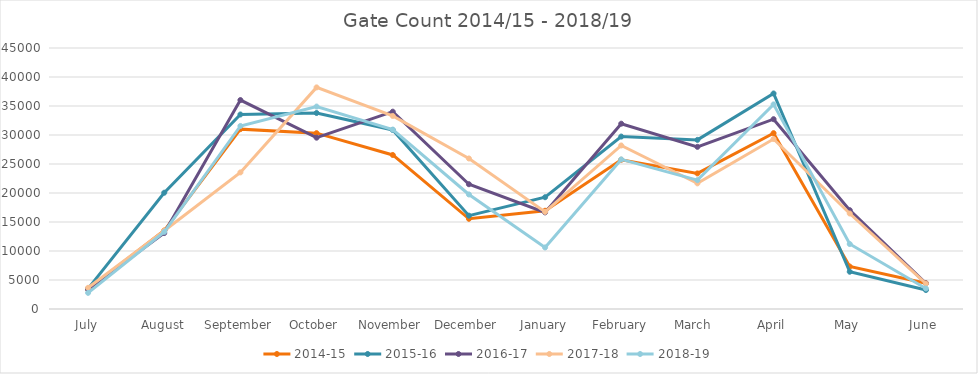
| Category | 2014-15 | 2015-16 | 2016-17 | 2017-18 | 2018-19 |
|---|---|---|---|---|---|
| July | 3427 | 3506 | 3392 | 3653 | 2782 |
| August | 13530 | 20050 | 13096 | 13479 | 13294 |
| September | 31012 | 33538 | 36026 | 23551 | 31557 |
| October | 30320 | 33791 | 29537 | 38209 | 34902 |
| November | 26556 | 30869 | 34023 | 33287 | 30931 |
| December | 15551 | 16096 | 21512 | 25951 | 19747 |
| January | 16941 | 19271 | 16654 | 16743 | 10612 |
| February | 25731 | 29730 | 31949 | 28193 | 25793 |
| March  | 23376 | 29158 | 27959 | 21661 | 22209 |
| April | 30320 | 37159 | 32727 | 29310 | 35279 |
| May | 7321 | 6424 | 17041 | 16462 | 11203 |
| June | 4453 | 3273 | 4431 | 4374 | 3544 |